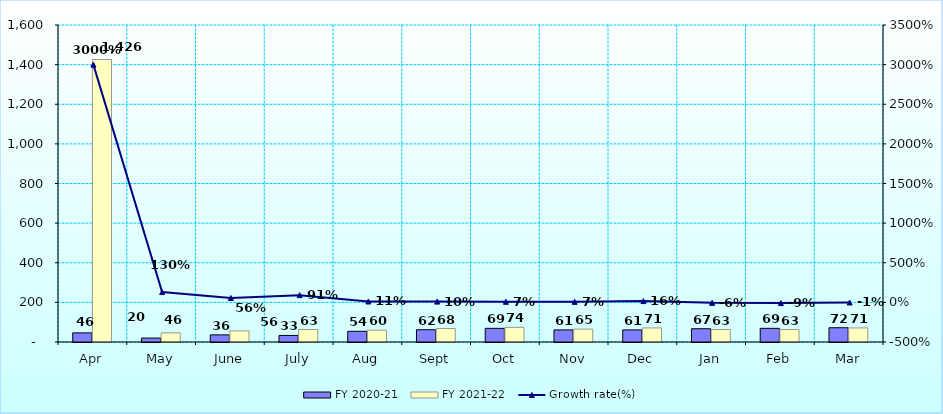
| Category | FY 2020-21 | FY 2021-22 |
|---|---|---|
| Apr | 46 | 1426 |
| May | 20 | 46 |
| June | 36 | 56 |
| July | 33 | 63 |
| Aug | 54 | 60 |
| Sept | 62 | 68 |
| Oct | 69 | 74 |
| Nov | 61 | 65 |
| Dec | 61 | 71 |
| Jan | 67 | 63 |
| Feb | 69 | 63 |
| Mar | 72 | 71 |